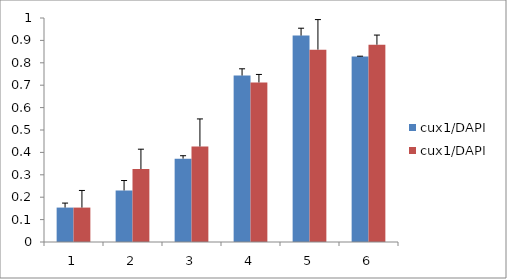
| Category | cux1/DAPI |
|---|---|
| 0 | 0.154 |
| 1 | 0.326 |
| 2 | 0.426 |
| 3 | 0.712 |
| 4 | 0.859 |
| 5 | 0.881 |